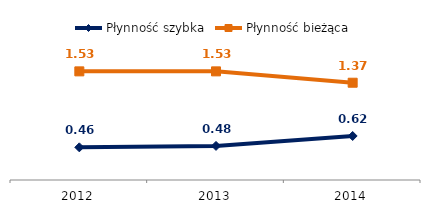
| Category | Płynność szybka | Płynność bieżąca |
|---|---|---|
| 2012.0 | 0.46 | 1.53 |
| 2013.0 | 0.48 | 1.53 |
| 2014.0 | 0.62 | 1.37 |